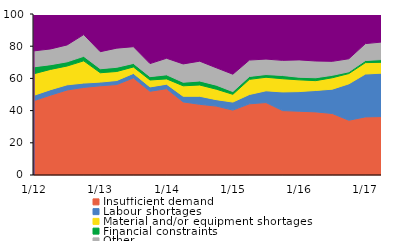
| Category | Insufficient demand | Labour shortages | Material and/or equipment shortages | Financial constraints | Other | None |
|---|---|---|---|---|---|---|
|  1/12 | 46.2 | 3.3 | 13.4 | 4.3 | 9.9 | 22.9 |
| 4 | 49.6 | 3.4 | 12.6 | 2.9 | 9.8 | 21.7 |
| 7 | 52.8 | 3.2 | 11.7 | 2.6 | 10.5 | 19.2 |
| 10 | 54.4 | 2.7 | 13.8 | 2.8 | 13.5 | 12.8 |
|  1/13 | 55.4 | 2.3 | 5.8 | 2.5 | 10.6 | 23.4 |
| 4 | 56.2 | 2.5 | 5.6 | 2.6 | 11.9 | 21.2 |
| 7 | 60.3 | 2.8 | 4 | 2.2 | 10.4 | 20.3 |
| 10 | 52 | 2.7 | 4.3 | 2.1 | 8.1 | 30.8 |
|  1/14 | 53.6 | 2.8 | 3.3 | 2.5 | 10.3 | 27.5 |
| 4 | 45.4 | 3.5 | 6.5 | 2.2 | 11.4 | 31 |
| 7 | 43.9 | 5 | 7 | 2.5 | 12.3 | 29.3 |
| 10 | 42.8 | 4 | 6.5 | 2.5 | 10.8 | 33.4 |
|  1/15 | 40.3 | 5 | 4.8 | 1.7 | 10.8 | 37.4 |
| 4 | 44.2 | 5.8 | 9.4 | 1.8 | 10.2 | 28.6 |
| 7 | 45 | 7.3 | 8.4 | 1.7 | 9.6 | 28 |
| 10 | 40 | 11.6 | 8.2 | 2 | 9.4 | 28.8 |
|  1/16 | 39.6 | 12.2 | 7.3 | 1.6 | 10.8 | 28.5 |
| 4 | 39.2 | 13.3 | 6.1 | 1.8 | 10.4 | 29.2 |
| 7 | 38.2 | 15.1 | 7.1 | 1.5 | 8.7 | 29.4 |
| 10 | 34 | 22.6 | 6.4 | 1.1 | 8.1 | 27.8 |
|  1/17 | 36.1 | 26.6 | 7.1 | 1.3 | 10.5 | 18.4 |
| 4 | 36.3 | 27 | 6.7 | 1.7 | 10.9 | 17.4 |